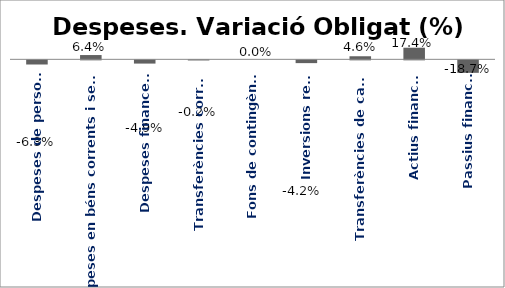
| Category | Series 0 |
|---|---|
| Despeses de personal | -0.063 |
| Despeses en béns corrents i serveis | 0.064 |
| Despeses financeres | -0.049 |
| Transferències corrents | -0.002 |
| Fons de contingència | 0 |
| Inversions reals | -0.042 |
| Transferències de capital | 0.046 |
| Actius financers | 0.174 |
| Passius financers | -0.187 |